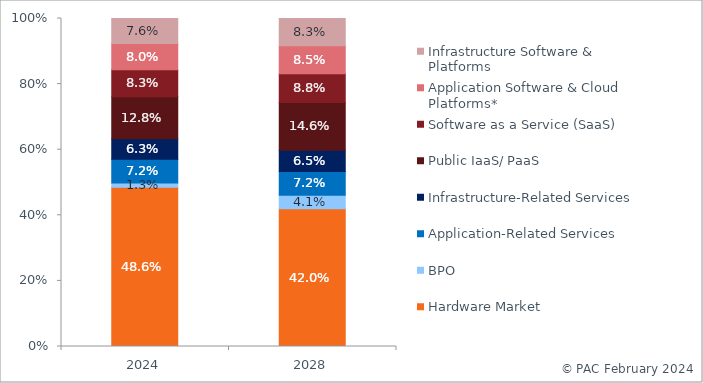
| Category | Hardware Market | BPO | Application-Related Services | Infrastructure-Related Services | Public IaaS/ PaaS | Software as a Service (SaaS) | Application Software & Cloud Platforms* | Infrastructure Software & Platforms |
|---|---|---|---|---|---|---|---|---|
| 2024.0 | 0.486 | 0.013 | 0.072 | 0.063 | 0.128 | 0.083 | 0.08 | 0.076 |
| 2028.0 | 0.42 | 0.041 | 0.072 | 0.065 | 0.146 | 0.088 | 0.085 | 0.083 |